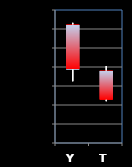
| Category | Series 0 | Series 1 | Series 2 | Series 3 |
|---|---|---|---|---|
| Y | 2784.5 | 2786.5 | 2725 | 2737.5 |
| T | 2736 | 2741 | 2704 | 2705.75 |